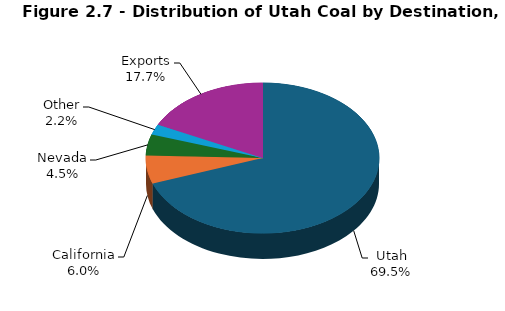
| Category | Series 0 |
|---|---|
| Utah | 9004.352 |
| California | 783.606 |
| Nevada | 582.453 |
| Other | 290.271 |
| Exports | 2291.8 |